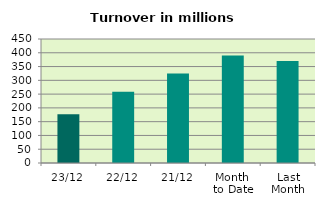
| Category | Series 0 |
|---|---|
| 23/12 | 176.543 |
| 22/12 | 258.225 |
| 21/12 | 324.483 |
| Month 
to Date | 389.949 |
| Last
Month | 369.747 |